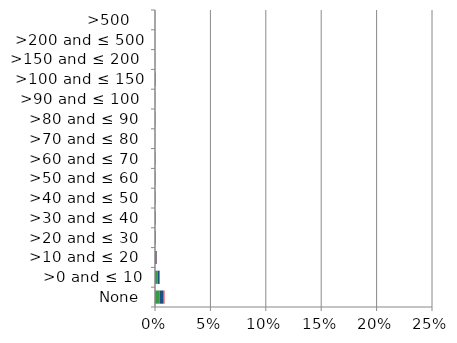
| Category | England | Scotland | Wales |
|---|---|---|---|
|  None | 0.004 | 0.003 | 0.001 |
| >0 and ≤ 10 | 0.002 | 0.002 | 0.001 |
| >10 and ≤ 20  | 0.001 | 0.001 | 0 |
| >20 and ≤ 30  | 0 | 0 | 0 |
| >30 and ≤ 40  | 0 | 0 | 0 |
| >40 and ≤ 50  | 0 | 0 | 0 |
| >50 and ≤ 60  | 0 | 0 | 0 |
| >60 and ≤ 70  | 0 | 0 | 0 |
| >70 and ≤ 80  | 0 | 0 | 0 |
| >80 and ≤ 90  | 0 | 0 | 0 |
| >90 and ≤ 100  | 0 | 0 | 0 |
| >100 and ≤ 150 | 0 | 0 | 0 |
| >150 and ≤ 200  | 0 | 0 | 0 |
| >200 and ≤ 500 | 0 | 0 | 0 |
| >500   | 0 | 0 | 0 |